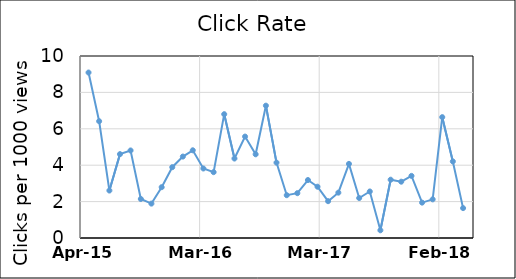
| Category | Series 0 |
|---|---|
| 42125.0 | 9.091 |
| 42156.0 | 6.418 |
| 42186.0 | 2.608 |
| 42217.0 | 4.608 |
| 42248.0 | 4.81 |
| 42278.0 | 2.144 |
| 42309.0 | 1.89 |
| 42339.0 | 2.792 |
| 42370.0 | 3.891 |
| 42401.0 | 4.474 |
| 42430.0 | 4.819 |
| 42461.0 | 3.819 |
| 42491.0 | 3.618 |
| 42522.0 | 6.803 |
| 42552.0 | 4.367 |
| 42583.0 | 5.573 |
| 42614.0 | 4.599 |
| 42644.0 | 7.271 |
| 42675.0 | 4.142 |
| 42705.0 | 2.352 |
| 42736.0 | 2.463 |
| 42767.0 | 3.185 |
| 42795.0 | 2.818 |
| 42826.0 | 2.023 |
| 42856.0 | 2.491 |
| 42887.0 | 4.072 |
| 42917.0 | 2.195 |
| 42948.0 | 2.556 |
| 42979.0 | 0.423 |
| 43009.0 | 3.204 |
| 43040.0 | 3.094 |
| 43070.0 | 3.413 |
| 43101.0 | 1.944 |
| 43132.0 | 2.123 |
| 43160.0 | 6.64 |
| 43191.0 | 4.209 |
| 43221.0 | 1.642 |